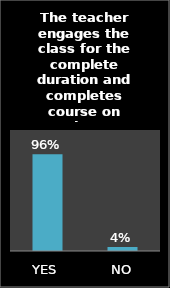
| Category | Series 0 |
|---|---|
| YES | 0.96 |
| NO | 0.04 |